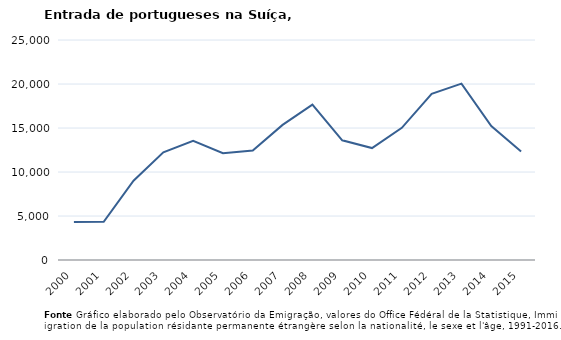
| Category | Entradas |
|---|---|
| 2000.0 | 4311 |
| 2001.0 | 4347 |
| 2002.0 | 9005 |
| 2003.0 | 12228 |
| 2004.0 | 13539 |
| 2005.0 | 12138 |
| 2006.0 | 12441 |
| 2007.0 | 15351 |
| 2008.0 | 17657 |
| 2009.0 | 13601 |
| 2010.0 | 12720 |
| 2011.0 | 15020 |
| 2012.0 | 18892 |
| 2013.0 | 20039 |
| 2014.0 | 15221 |
| 2015.0 | 12325 |